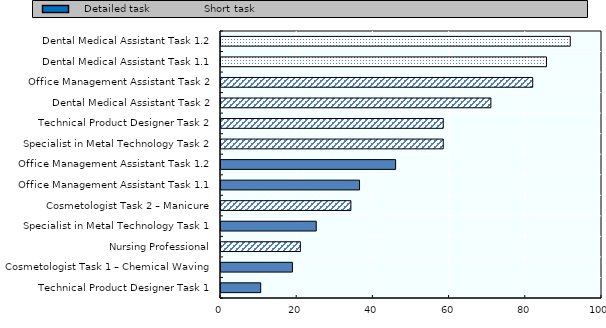
| Category | Mean rating |
|---|---|
| Technical Product Designer Task 1 | 10.417 |
| Cosmetologist Task 1 – Chemical Waving | 18.75 |
| Nursing Professional | 20.833 |
| Specialist in Metal Technology Task 1 | 25 |
| Cosmetologist Task 2 – Manicure | 34.091 |
| Office Management Assistant Task 1.1 | 36.364 |
| Office Management Assistant Task 1.2 | 45.833 |
| Specialist in Metal Technology Task 2 | 58.333 |
| Technical Product Designer Task 2 | 58.333 |
| Dental Medical Assistant Task 2 | 70.833 |
| Office Management Assistant Task 2 | 81.818 |
| Dental Medical Assistant Task 1.1 | 85.417 |
| Dental Medical Assistant Task 1.2 | 91.667 |